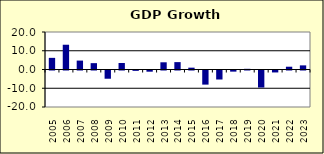
| Category | 14.4 |
|---|---|
| 2005.0 | 6.209 |
| 2006.0 | 13.208 |
| 2007.0 | 4.754 |
| 2008.0 | 3.39 |
| 2009.0 | -4.391 |
| 2010.0 | 3.461 |
| 2011.0 | -0.192 |
| 2012.0 | -0.633 |
| 2013.0 | 3.844 |
| 2014.0 | 3.936 |
| 2015.0 | 0.978 |
| 2016.0 | -7.527 |
| 2017.0 | -4.801 |
| 2018.0 | -0.602 |
| 2019.0 | 0.361 |
| 2020.0 | -9.078 |
| 2021.0 | -1.037 |
| 2022.0 | 1.482 |
| 2023.0 | 2.2 |